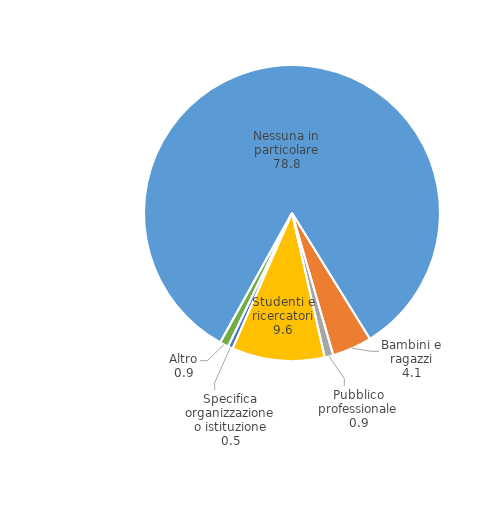
| Category | Series 0 |
|---|---|
| Nessuna in particolare | 78.8 |
| Bambini e ragazzi | 4.1 |
| Pubblico professionale | 0.9 |
| Studenti e ricercatori | 9.6 |
| Specifica organizzazione o istituzione | 0.5 |
| Altro | 0.9 |